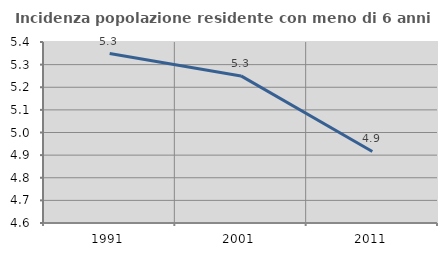
| Category | Incidenza popolazione residente con meno di 6 anni |
|---|---|
| 1991.0 | 5.349 |
| 2001.0 | 5.25 |
| 2011.0 | 4.916 |